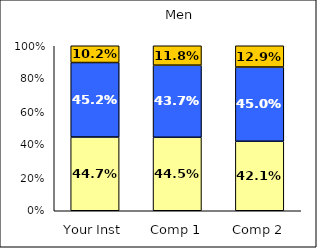
| Category | Low Likelihood of College Involvement | Average Likelihood of College Involvement | High Likelihood of College Involvement |
|---|---|---|---|
| Your Inst | 0.447 | 0.452 | 0.102 |
| Comp 1 | 0.445 | 0.437 | 0.118 |
| Comp 2 | 0.421 | 0.45 | 0.129 |